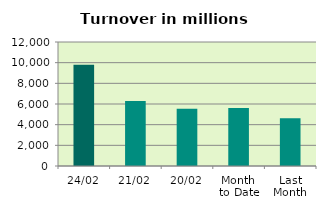
| Category | Series 0 |
|---|---|
| 24/02 | 9807.386 |
| 21/02 | 6299.429 |
| 20/02 | 5544.568 |
| Month 
to Date | 5622.484 |
| Last
Month | 4609.616 |